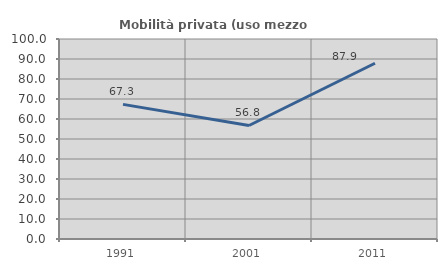
| Category | Mobilità privata (uso mezzo privato) |
|---|---|
| 1991.0 | 67.308 |
| 2001.0 | 56.757 |
| 2011.0 | 87.879 |